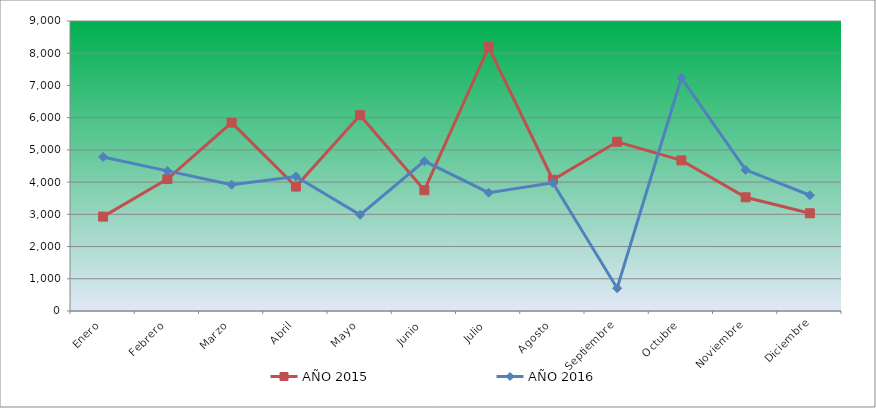
| Category | AÑO 2015 | AÑO 2016 |
|---|---|---|
| Enero | 2929.759 | 4779.987 |
| Febrero | 4094.625 | 4348.01 |
| Marzo | 5845.444 | 3919.822 |
| Abril | 3861.314 | 4175.388 |
| Mayo | 6077.31 | 2985.286 |
| Junio | 3748.775 | 4650.596 |
| Julio | 8187.745 | 3673.144 |
| Agosto | 4073.064 | 3977.8 |
| Septiembre | 5252.621 | 707.652 |
| Octubre | 4673.794 | 7237.331 |
| Noviembre | 3528.79 | 4379.457 |
| Diciembre | 3032.774 | 3592.794 |